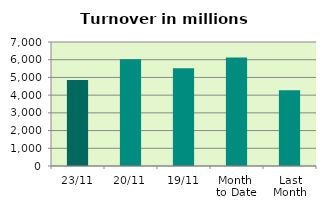
| Category | Series 0 |
|---|---|
| 23/11 | 4847.974 |
| 20/11 | 6022.121 |
| 19/11 | 5513.048 |
| Month 
to Date | 6120.214 |
| Last
Month | 4277.774 |